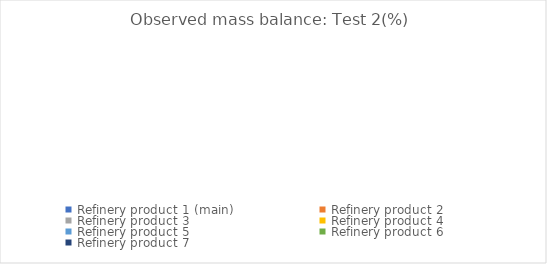
| Category | Test 2(%) |
|---|---|
| Refinery product 1 (main) | 0 |
| Refinery product 2 | 0 |
| Refinery product 3 | 0 |
| Refinery product 4 | 0 |
| Refinery product 5 | 0 |
| Refinery product 6 | 0 |
| Refinery product 7 | 0 |